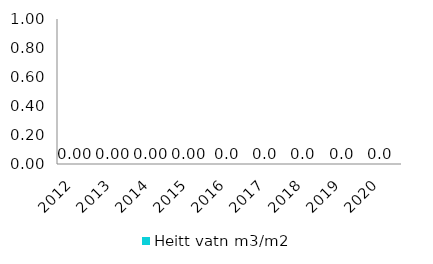
| Category | Heitt vatn m3/m2 |
|---|---|
| 2012.0 | 0 |
| 2013.0 | 0 |
| 2014.0 | 0 |
| 2015.0 | 0 |
| 2016.0 | 0 |
| 2017.0 | 0 |
| 2018.0 | 0 |
| 2019.0 | 0 |
| 2020.0 | 0 |